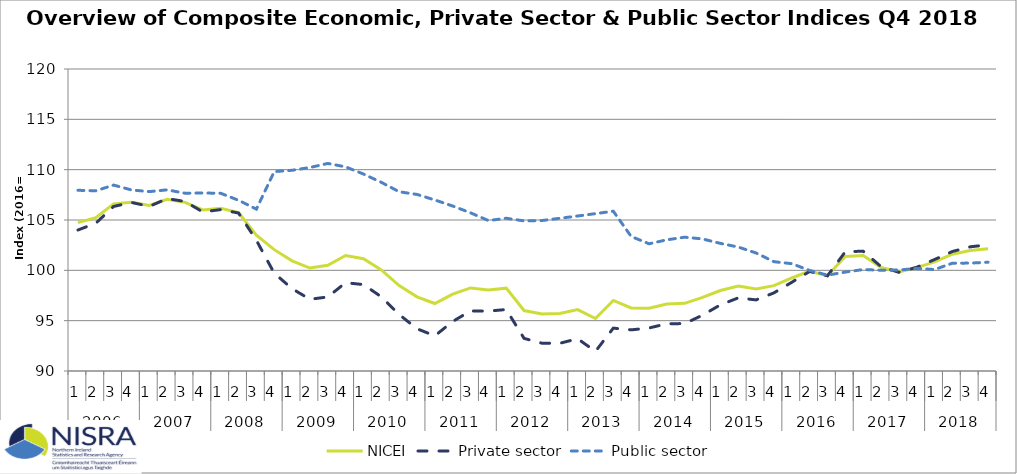
| Category | NICEI | Private sector | Public sector |
|---|---|---|---|
| 0 | 104.74 | 104.004 | 107.951 |
| 1 | 105.224 | 104.677 | 107.903 |
| 2 | 106.601 | 106.344 | 108.47 |
| 3 | 106.773 | 106.746 | 107.985 |
| 4 | 106.439 | 106.351 | 107.82 |
| 5 | 107.054 | 107.126 | 107.995 |
| 6 | 106.755 | 106.838 | 107.66 |
| 7 | 105.997 | 105.799 | 107.68 |
| 8 | 106.165 | 106.035 | 107.656 |
| 9 | 105.73 | 105.69 | 106.958 |
| 10 | 103.503 | 102.983 | 106.08 |
| 11 | 102.055 | 99.717 | 109.808 |
| 12 | 100.941 | 98.175 | 109.939 |
| 13 | 100.229 | 97.125 | 110.215 |
| 14 | 100.505 | 97.358 | 110.617 |
| 15 | 101.469 | 98.769 | 110.278 |
| 16 | 101.153 | 98.586 | 109.566 |
| 17 | 100.041 | 97.373 | 108.741 |
| 18 | 98.492 | 95.613 | 107.806 |
| 19 | 97.368 | 94.197 | 107.539 |
| 20 | 96.703 | 93.495 | 106.987 |
| 21 | 97.633 | 94.921 | 106.39 |
| 22 | 98.253 | 95.963 | 105.712 |
| 23 | 98.057 | 95.951 | 104.946 |
| 24 | 98.23 | 96.106 | 105.174 |
| 25 | 96.007 | 93.24 | 104.912 |
| 26 | 95.656 | 92.762 | 104.946 |
| 27 | 95.704 | 92.753 | 105.169 |
| 28 | 96.1 | 93.205 | 105.397 |
| 29 | 95.214 | 91.95 | 105.634 |
| 30 | 97.01 | 94.258 | 105.872 |
| 31 | 96.264 | 94.087 | 103.365 |
| 32 | 96.231 | 94.269 | 102.638 |
| 33 | 96.653 | 94.701 | 103.031 |
| 34 | 96.721 | 94.708 | 103.293 |
| 35 | 97.317 | 95.546 | 103.118 |
| 36 | 97.999 | 96.572 | 102.677 |
| 37 | 98.441 | 97.262 | 102.314 |
| 38 | 98.151 | 97.063 | 101.727 |
| 39 | 98.48 | 97.76 | 100.859 |
| 40 | 99.241 | 98.811 | 100.66 |
| 41 | 99.915 | 99.891 | 99.992 |
| 42 | 99.469 | 99.453 | 99.521 |
| 43 | 101.376 | 101.845 | 99.827 |
| 44 | 101.479 | 101.903 | 100.079 |
| 45 | 100.284 | 100.372 | 100.011 |
| 46 | 99.85 | 99.805 | 100.025 |
| 47 | 100.274 | 100.304 | 100.195 |
| 48 | 100.841 | 101.073 | 100.079 |
| 49 | 101.602 | 101.872 | 100.709 |
| 50 | 101.962 | 102.336 | 100.719 |
| 51 | 102.137 | 102.536 | 100.806 |